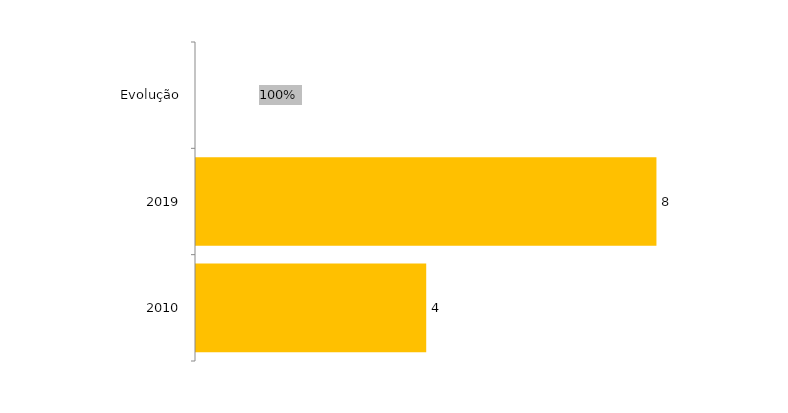
| Category | Evolução Residência |
|---|---|
| 2010 | 4 |
| 2019 | 8 |
| Evolução | 1 |